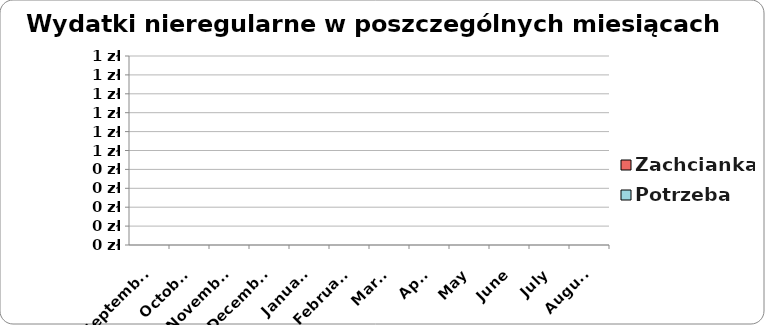
| Category | Potrzeba | Zachcianka |
|---|---|---|
| 2023-09-01 | 0 | 0 |
| 2023-10-01 | 0 | 0 |
| 2023-11-01 | 0 | 0 |
| 2023-12-01 | 0 | 0 |
| 2024-01-01 | 0 | 0 |
| 2024-02-01 | 0 | 0 |
| 2024-03-01 | 0 | 0 |
| 2024-04-01 | 0 | 0 |
| 2024-05-01 | 0 | 0 |
| 2024-06-01 | 0 | 0 |
| 2024-07-01 | 0 | 0 |
| 2024-08-01 | 0 | 0 |